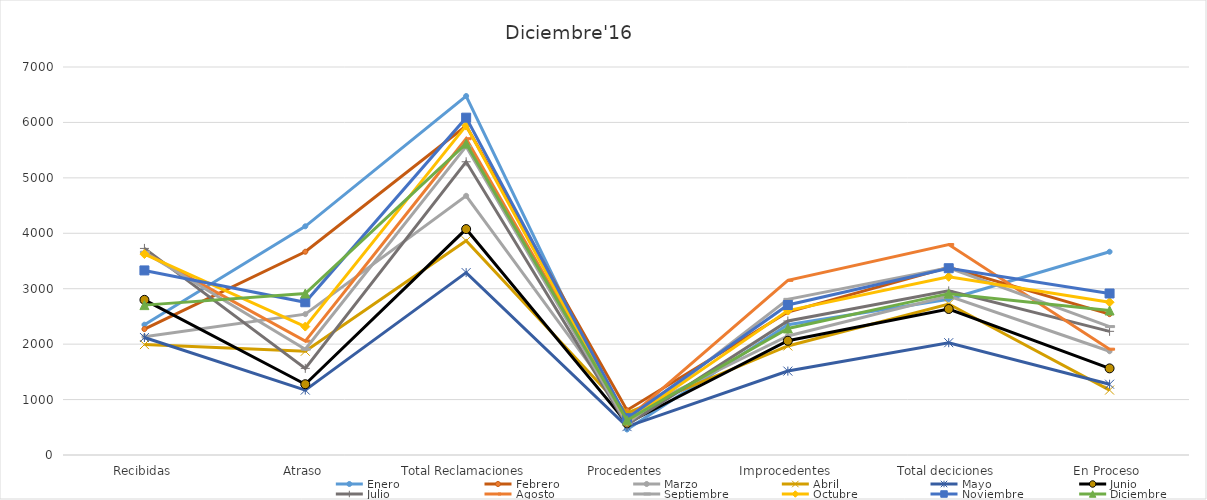
| Category | Enero  | Febrero | Marzo | Abril | Mayo | Junio | Julio | Agosto | Septiembre | Octubre | Noviembre | Diciembre |
|---|---|---|---|---|---|---|---|---|---|---|---|---|
| Recibidas | 2351 | 2272 | 2135 | 1992 | 2120 | 2799 | 3727 | 3652 | 3659 | 3625 | 3330 | 2704 |
| Atraso | 4126 | 3667 | 2541 | 1872 | 1171 | 1277 | 1563 | 2054 | 1909 | 2317 | 2756 | 2914 |
| Total Reclamaciones | 6477 | 5939 | 4676 | 3864 | 3291 | 4076 | 5290 | 5706 | 5568 | 5942 | 6086 | 5618 |
| Procedentes | 460 | 807 | 720 | 757 | 512 | 573 | 544 | 646 | 570 | 610 | 664 | 626 |
| Improcedentes | 2350 | 2579 | 2148 | 1967 | 1514 | 2061 | 2417 | 3151 | 2808 | 2605 | 2706 | 2283 |
| Total deciciones | 2810 | 3386 | 2868 | 2724 | 2026 | 2634 | 2961 | 3797 | 3378 | 3215 | 3370 | 2911 |
| En Proceso | 3667 | 2541 | 1872 | 1171 | 1277 | 1563 | 2231 | 1909 | 2317 | 2756 | 2914 | 2607 |